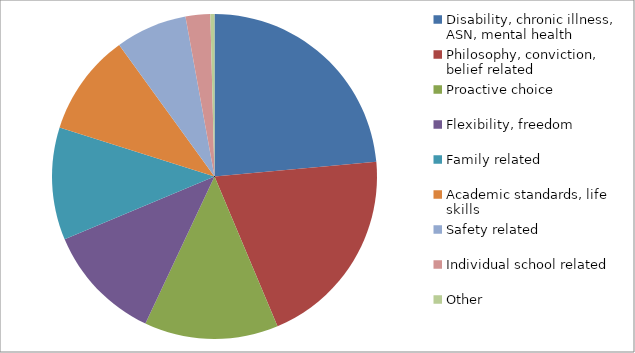
| Category | Series 0 |
|---|---|
| Disability, chronic illness, ASN, mental health | 288 |
| Philosophy, conviction, belief related | 246 |
| Proactive choice | 163 |
| Flexibility, freedom | 143 |
| Family related | 137 |
| Academic standards, life skills | 124 |
| Safety related | 87 |
| Individual school related | 30 |
| Other | 5 |